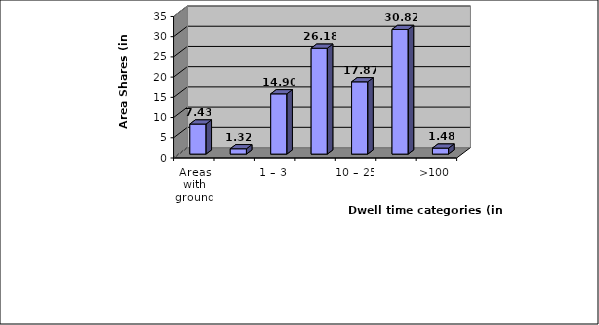
| Category | Surface proportion (in %) |
|---|---|
| Areas with groundwater discharge: Discharge amount > 10 mm/a | 7.43 |
| < 1 | 1.32 |
| 1 – 3 | 14.9 |
| 3 – 10 | 26.18 |
| 10 – 25 | 17.87 |
| 25 –100 | 30.82 |
| >100 | 1.48 |